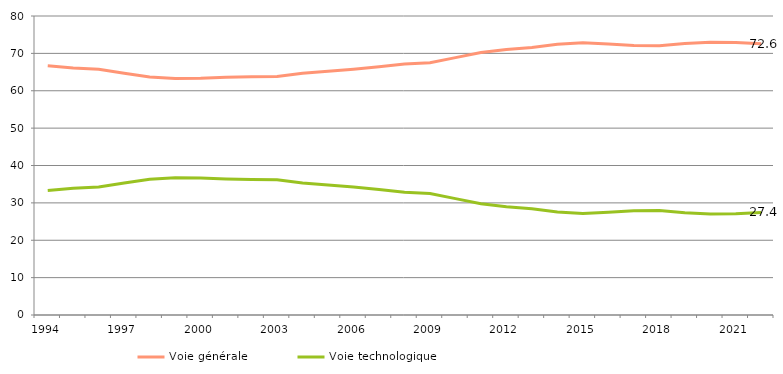
| Category | Voie générale | Voie technologique |
|---|---|---|
| 1994 | 66.667 | 33.333 |
| 1995 | 66.109 | 33.891 |
| 1996 | 65.769 | 34.231 |
| 1997 | 64.669 | 35.331 |
| 1998 | 63.685 | 36.315 |
| 1999 | 63.265 | 36.735 |
| 2000 | 63.33 | 36.67 |
| 2001 | 63.596 | 36.404 |
| 2002 | 63.714 | 36.286 |
| 2003 | 63.838 | 36.162 |
| 2004 | 64.676 | 35.324 |
| 2005 | 65.226 | 34.774 |
| 2006 | 65.783 | 34.217 |
| 2007 | 66.409 | 33.591 |
| 2008 | 67.184 | 32.816 |
| 2009 | 67.493 | 32.507 |
| 2010 | 68.867 | 31.133 |
| 2011 | 70.21 | 29.79 |
| 2012 | 71.012 | 28.988 |
| 2013 | 71.572 | 28.428 |
| 2014 | 72.426 | 27.574 |
| 2015 | 72.827 | 27.173 |
| 2016 | 72.51 | 27.49 |
| 2017 | 72.097 | 27.903 |
| 2018 | 72.015 | 27.985 |
| 2019 | 72.651 | 27.349 |
| 2020 | 72.972 | 27.028 |
| 2021 | 72.902 | 27.098 |
| 2022 | 72.564 | 27.436 |